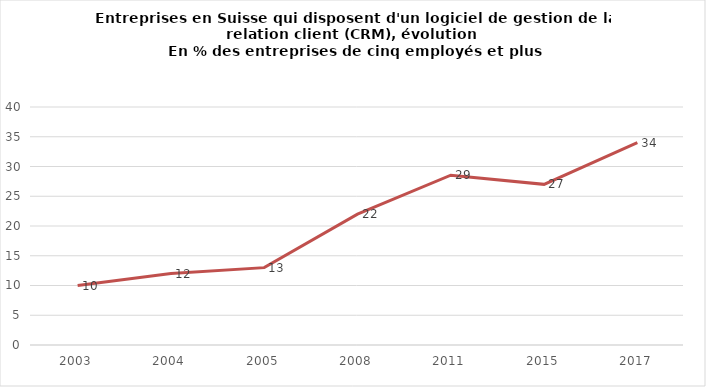
| Category | % |
|---|---|
| 2003.0 | 10 |
| 2004.0 | 12 |
| 2005.0 | 13 |
| 2008.0 | 22 |
| 2011.0 | 28.543 |
| 2015.0 | 27 |
| 2017.0 | 34 |